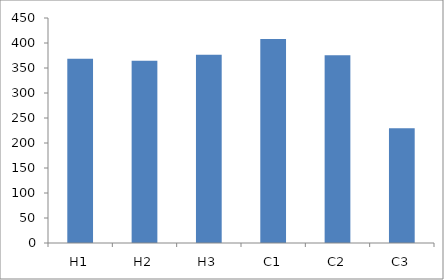
| Category | Series 0 |
|---|---|
| H1 | 368.619 |
| H2 | 364.721 |
| H3 | 376.536 |
| C1 | 408.125 |
| C2 | 375.667 |
| C3 | 229.352 |